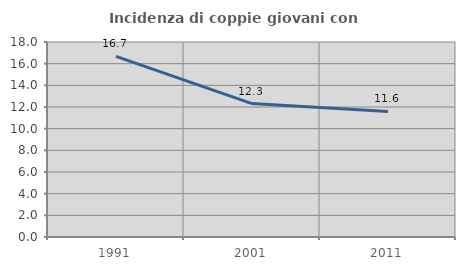
| Category | Incidenza di coppie giovani con figli |
|---|---|
| 1991.0 | 16.667 |
| 2001.0 | 12.316 |
| 2011.0 | 11.59 |